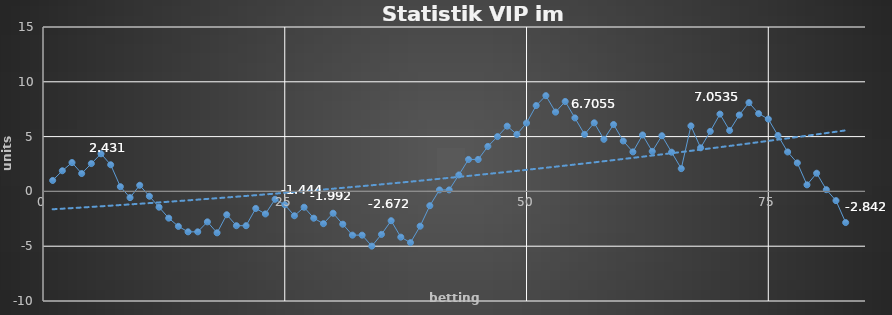
| Category | Series 0 |
|---|---|
| 0 | 1 |
| 1 | 1.884 |
| 2 | 2.63 |
| 3 | 1.63 |
| 4 | 2.539 |
| 5 | 3.431 |
| 6 | 2.431 |
| 7 | 0.431 |
| 8 | -0.569 |
| 9 | 0.561 |
| 10 | -0.439 |
| 11 | -1.439 |
| 12 | -2.439 |
| 13 | -3.189 |
| 14 | -3.689 |
| 15 | -3.689 |
| 16 | -2.779 |
| 17 | -3.779 |
| 18 | -2.129 |
| 19 | -3.129 |
| 20 | -3.129 |
| 21 | -1.554 |
| 22 | -2.054 |
| 23 | -0.719 |
| 24 | -1.219 |
| 25 | -2.219 |
| 26 | -1.444 |
| 27 | -2.444 |
| 28 | -2.944 |
| 29 | -1.992 |
| 30 | -2.992 |
| 31 | -3.992 |
| 32 | -3.992 |
| 33 | -4.992 |
| 34 | -3.922 |
| 35 | -2.672 |
| 36 | -4.172 |
| 37 | -4.672 |
| 38 | -3.172 |
| 39 | -1.304 |
| 40 | 0.137 |
| 41 | 0.137 |
| 42 | 1.501 |
| 43 | 2.915 |
| 44 | 2.915 |
| 45 | 4.105 |
| 46 | 5.006 |
| 47 | 5.956 |
| 48 | 5.206 |
| 49 | 6.236 |
| 50 | 7.836 |
| 51 | 8.736 |
| 52 | 7.236 |
| 53 | 8.206 |
| 54 | 6.706 |
| 55 | 5.206 |
| 56 | 6.256 |
| 57 | 4.756 |
| 58 | 6.106 |
| 59 | 4.606 |
| 60 | 3.606 |
| 61 | 5.15 |
| 62 | 3.65 |
| 63 | 5.078 |
| 64 | 3.578 |
| 65 | 2.078 |
| 66 | 5.978 |
| 67 | 3.978 |
| 68 | 5.478 |
| 69 | 7.054 |
| 70 | 5.554 |
| 71 | 6.968 |
| 72 | 8.098 |
| 73 | 7.098 |
| 74 | 6.598 |
| 75 | 5.098 |
| 76 | 3.598 |
| 77 | 2.598 |
| 78 | 0.598 |
| 79 | 1.658 |
| 80 | 0.158 |
| 81 | -0.842 |
| 82 | -2.842 |